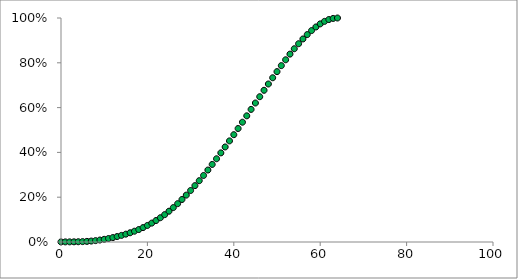
| Category | Series 0 |
|---|---|
| 0.0 | 0 |
| 1.0 | 0.001 |
| 2.0 | 0.001 |
| 3.0 | 0.001 |
| 4.0 | 0.001 |
| 5.0 | 0.002 |
| 6.0 | 0.003 |
| 7.0 | 0.004 |
| 8.0 | 0.006 |
| 9.0 | 0.009 |
| 10.0 | 0.012 |
| 11.0 | 0.016 |
| 12.0 | 0.02 |
| 13.0 | 0.024 |
| 14.0 | 0.029 |
| 15.0 | 0.035 |
| 16.0 | 0.041 |
| 17.0 | 0.048 |
| 18.0 | 0.056 |
| 19.0 | 0.064 |
| 20.0 | 0.074 |
| 21.0 | 0.084 |
| 22.0 | 0.096 |
| 23.0 | 0.108 |
| 24.0 | 0.122 |
| 25.0 | 0.137 |
| 26.0 | 0.154 |
| 27.0 | 0.171 |
| 28.0 | 0.19 |
| 29.0 | 0.209 |
| 30.0 | 0.23 |
| 31.0 | 0.252 |
| 32.0 | 0.274 |
| 33.0 | 0.297 |
| 34.0 | 0.321 |
| 35.0 | 0.346 |
| 36.0 | 0.372 |
| 37.0 | 0.398 |
| 38.0 | 0.424 |
| 39.0 | 0.451 |
| 40.0 | 0.479 |
| 41.0 | 0.507 |
| 42.0 | 0.535 |
| 43.0 | 0.563 |
| 44.0 | 0.592 |
| 45.0 | 0.621 |
| 46.0 | 0.649 |
| 47.0 | 0.677 |
| 48.0 | 0.705 |
| 49.0 | 0.733 |
| 50.0 | 0.761 |
| 51.0 | 0.787 |
| 52.0 | 0.814 |
| 53.0 | 0.839 |
| 54.0 | 0.863 |
| 55.0 | 0.885 |
| 56.0 | 0.906 |
| 57.0 | 0.926 |
| 58.0 | 0.944 |
| 59.0 | 0.96 |
| 60.0 | 0.974 |
| 61.0 | 0.985 |
| 62.0 | 0.993 |
| 63.0 | 0.998 |
| 64.0 | 1 |